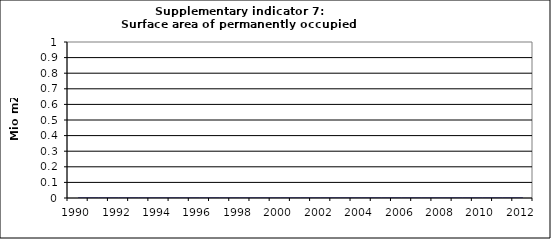
| Category | Surface area of permanently occupied dwellings, Mio m2  |
|---|---|
| 1990 | 0 |
| 1991 | 0 |
| 1992 | 0 |
| 1993 | 0 |
| 1994 | 0 |
| 1995 | 0 |
| 1996 | 0 |
| 1997 | 0 |
| 1998 | 0 |
| 1999 | 0 |
| 2000 | 0 |
| 2001 | 0 |
| 2002 | 0 |
| 2003 | 0 |
| 2004 | 0 |
| 2005 | 0 |
| 2006 | 0 |
| 2007 | 0 |
| 2008 | 0 |
| 2009 | 0 |
| 2010 | 0 |
| 2011 | 0 |
| 2012 | 0 |